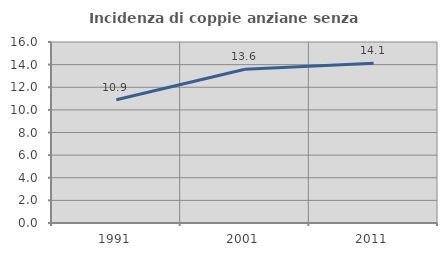
| Category | Incidenza di coppie anziane senza figli  |
|---|---|
| 1991.0 | 10.897 |
| 2001.0 | 13.593 |
| 2011.0 | 14.114 |